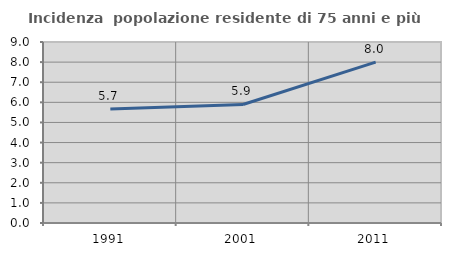
| Category | Incidenza  popolazione residente di 75 anni e più |
|---|---|
| 1991.0 | 5.665 |
| 2001.0 | 5.893 |
| 2011.0 | 7.996 |